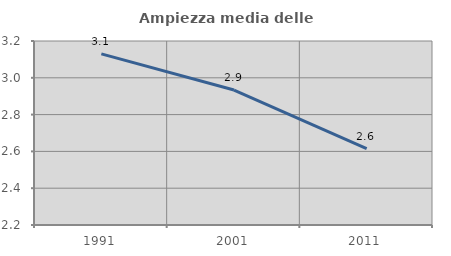
| Category | Ampiezza media delle famiglie |
|---|---|
| 1991.0 | 3.13 |
| 2001.0 | 2.933 |
| 2011.0 | 2.615 |